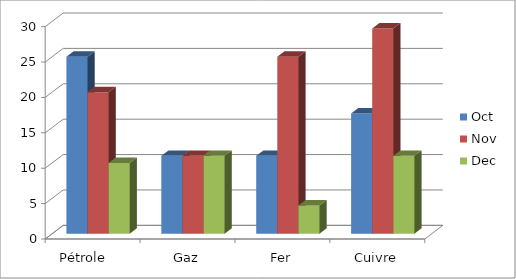
| Category | Oct | Nov | Dec |
|---|---|---|---|
| Pétrole     | 25 | 20 | 10 |
| Gaz | 11 | 11 | 11 |
| Fer | 11 | 25 | 4 |
| Cuivre | 17 | 29 | 11 |